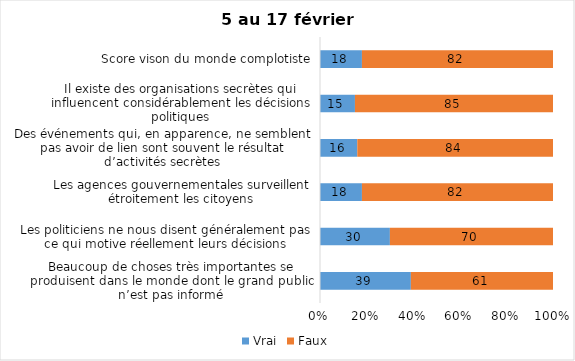
| Category | Vrai | Faux |
|---|---|---|
| Beaucoup de choses très importantes se produisent dans le monde dont le grand public n’est pas informé | 39 | 61 |
| Les politiciens ne nous disent généralement pas ce qui motive réellement leurs décisions | 30 | 70 |
| Les agences gouvernementales surveillent étroitement les citoyens | 18 | 82 |
| Des événements qui, en apparence, ne semblent pas avoir de lien sont souvent le résultat d’activités secrètes | 16 | 84 |
| Il existe des organisations secrètes qui influencent considérablement les décisions politiques | 15 | 85 |
| Score vison du monde complotiste | 18 | 82 |